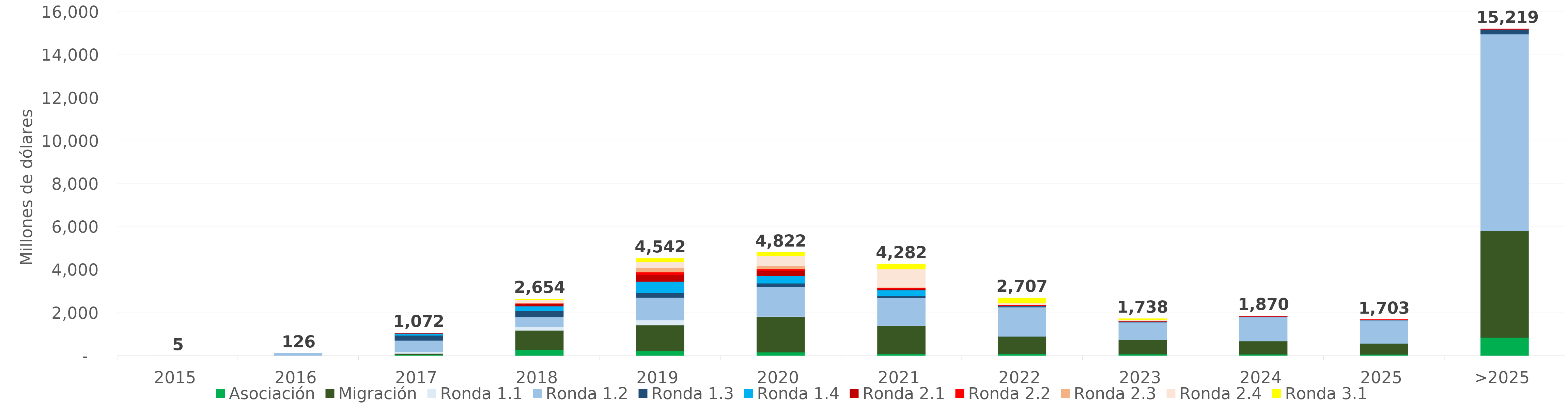
| Category | Asociación | Migración | Ronda 1.1 | Ronda 1.2 | Ronda 1.3 | Ronda 1.4 | Ronda 2.1 | Ronda 2.2 | Ronda 2.3 | Ronda 2.4 | Ronda 3.1 |
|---|---|---|---|---|---|---|---|---|---|---|---|
| 2015 | 0 | 0 | 4.573 | 0.236 | 0 | 0 | 0 | 0 | 0 | 0 | 0 |
| 2016 | 0 | 0 | 16.79 | 108.909 | 0 | 0 | 0 | 0 | 0 | 0 | 0 |
| 2017 | 50.877 | 65.422 | 76.429 | 533.486 | 231.789 | 93.443 | 18.851 | 1.29 | 0.72 | 0 | 0 |
| 2018 | 289.394 | 902.921 | 155.042 | 470.128 | 278.302 | 226.903 | 104.896 | 21.902 | 26.974 | 139.641 | 37.691 |
| 2019 | 241.207 | 1195.818 | 236.68 | 1049.68 | 207.126 | 540.649 | 302.09 | 133.009 | 199.161 | 270.262 | 166.186 |
| 2020 | 177.3 | 1656.852 | 6.736 | 1382.287 | 160.039 | 341.057 | 255.4 | 60.688 | 156.484 | 477.469 | 148.013 |
| 2021 | 111.804 | 1298.547 | 2.229 | 1293.069 | 88.66 | 274.593 | 68.406 | 44.429 | 10.051 | 847.746 | 242.801 |
| 2022 | 112.591 | 798.545 | 0 | 1363.556 | 40.604 | 10.69 | 23.744 | 30.043 | 0 | 82.428 | 244.664 |
| 2023 | 87.085 | 669.696 | 0 | 815.124 | 34.741 | 0.73 | 0 | 36.282 | 0 | 32.499 | 62.088 |
| 2024 | 79.455 | 613.256 | 0 | 1120.717 | 30.041 | 0 | 0 | 26.685 | 0 | 0 | 0 |
| 2025 | 75.288 | 512.631 | 0 | 1074.435 | 30.797 | 0 | 0 | 9.414 | 0 | 0 | 0 |
| >2025 | 859.226 | 4966.547 | 0 | 9146.402 | 225.326 | 0 | 0 | 21.146 | 0 | 0 | 0 |